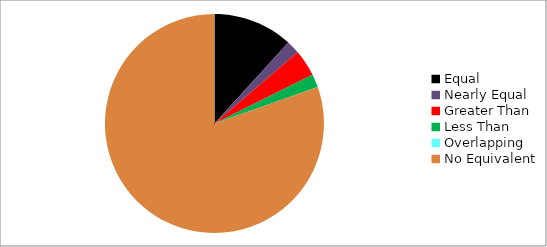
| Category | Series 0 |
|---|---|
| Equal | 6 |
| Nearly Equal | 1 |
| Greater Than | 2 |
| Less Than | 1 |
| Overlapping | 0 |
| No Equivalent | 41 |